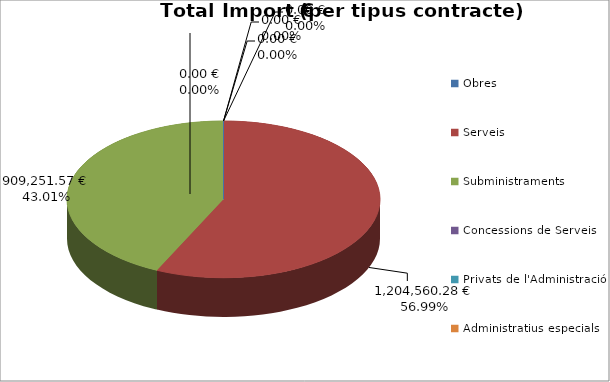
| Category | Total preu              (amb iva) |
|---|---|
| Obres | 0 |
| Serveis | 1204560.28 |
| Subministraments | 909251.57 |
| Concessions de Serveis | 0 |
| Privats de l'Administració | 0 |
| Administratius especials | 0 |